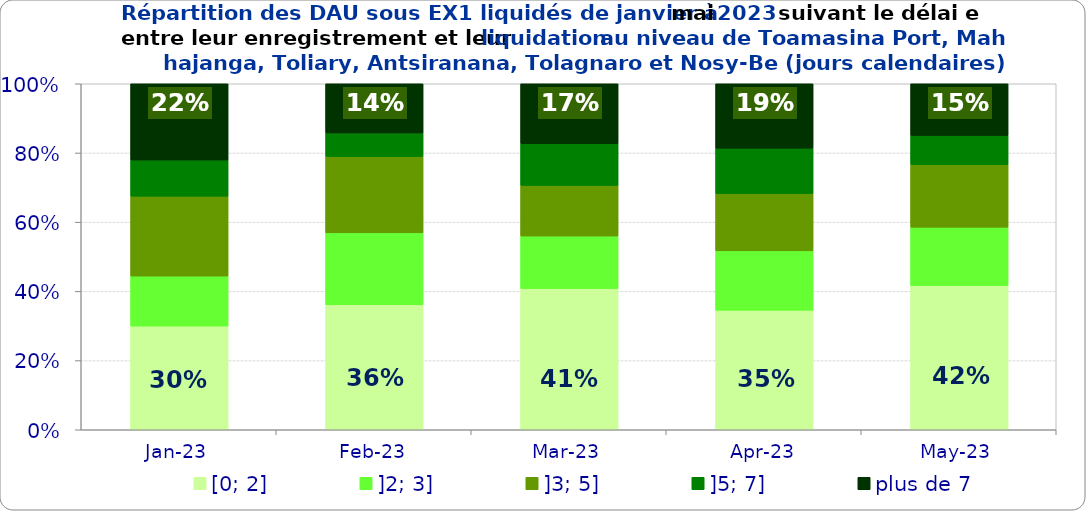
| Category | [0; 2] | ]2; 3] | ]3; 5] | ]5; 7] | plus de 7 |
|---|---|---|---|---|---|
| 2023-01-01 | 0.3 | 0.145 | 0.231 | 0.104 | 0.221 |
| 2023-02-01 | 0.362 | 0.208 | 0.221 | 0.068 | 0.142 |
| 2023-03-01 | 0.408 | 0.152 | 0.146 | 0.121 | 0.173 |
| 2023-04-01 | 0.345 | 0.172 | 0.165 | 0.131 | 0.186 |
| 2023-05-01 | 0.417 | 0.169 | 0.181 | 0.084 | 0.149 |